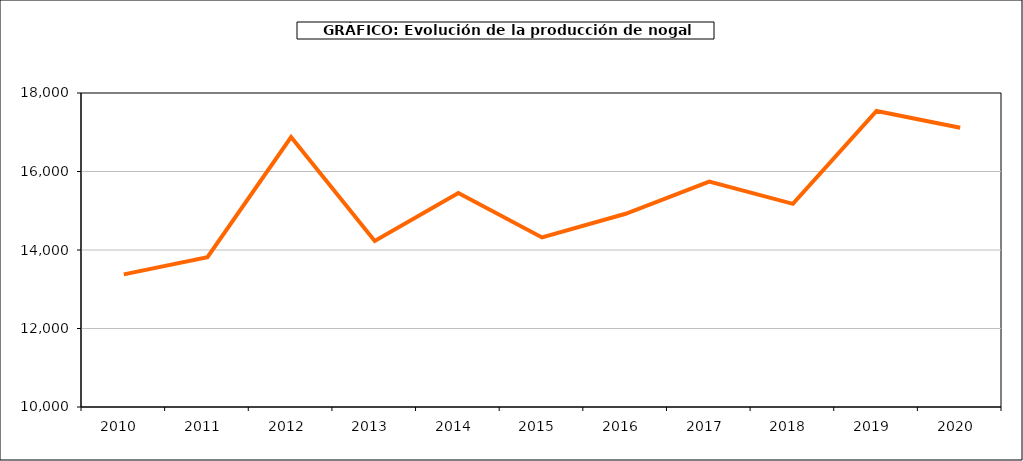
| Category | producción nogal |
|---|---|
| 2010.0 | 13378 |
| 2011.0 | 13815 |
| 2012.0 | 16877 |
| 2013.0 | 14230 |
| 2014.0 | 15450 |
| 2015.0 | 14319 |
| 2016.0 | 14923 |
| 2017.0 | 15744 |
| 2018.0 | 15176 |
| 2019.0 | 17542 |
| 2020.0 | 17114 |